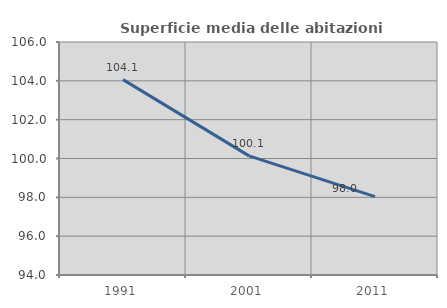
| Category | Superficie media delle abitazioni occupate |
|---|---|
| 1991.0 | 104.062 |
| 2001.0 | 100.136 |
| 2011.0 | 98.036 |